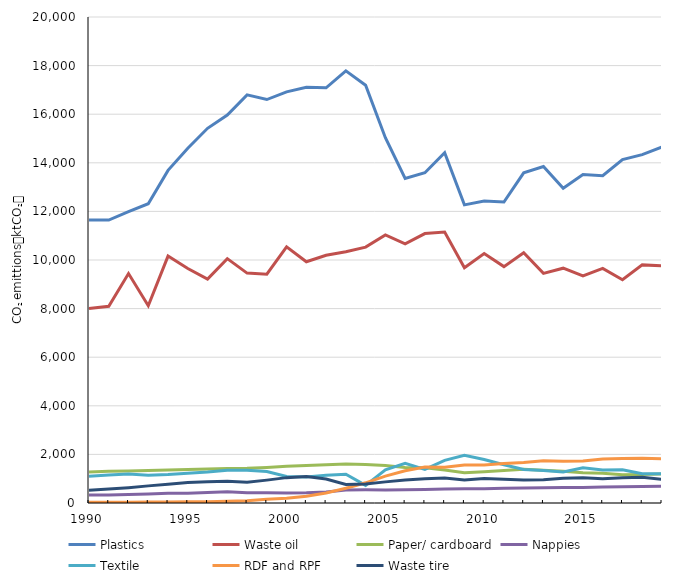
| Category | Plastics | Waste oil | Paper/ cardboard | Nappies | Textile | RDF and RPF | Waste tire |
|---|---|---|---|---|---|---|---|
| 1990.0 | 11648.086 | 7999.541 | 1275.543 | 331.81 | 1098.79 | 34.314 | 526.861 |
| 1991.0 | 11643.228 | 8094.996 | 1311.194 | 329.37 | 1147.652 | 34.314 | 571.418 |
| 1992.0 | 11988.974 | 9442.154 | 1320.871 | 347.668 | 1189.886 | 34.314 | 630.325 |
| 1993.0 | 12314.102 | 8118.312 | 1334.398 | 374.506 | 1142.625 | 41.467 | 704.837 |
| 1994.0 | 13688.559 | 10161.076 | 1357.948 | 400.123 | 1175.451 | 44.124 | 770.96 |
| 1995.0 | 14598.872 | 9652.262 | 1375.867 | 406.223 | 1227.623 | 50.897 | 845.166 |
| 1996.0 | 15419.045 | 9211.965 | 1399.255 | 434.28 | 1278.381 | 53.427 | 872.744 |
| 1997.0 | 15966.662 | 10056.47 | 1420.915 | 458.678 | 1347.411 | 72.73 | 891.336 |
| 1998.0 | 16796.607 | 9460.544 | 1430.889 | 423.301 | 1348.352 | 97.234 | 850.194 |
| 1999.0 | 16602.94 | 9417.258 | 1464.736 | 424.573 | 1295.176 | 155.744 | 941.742 |
| 2000.0 | 16921.165 | 10543.673 | 1510.774 | 414.981 | 1092.153 | 197.435 | 1044.119 |
| 2001.0 | 17112.213 | 9926.192 | 1542.13 | 418.875 | 1074.687 | 280.924 | 1085.438 |
| 2002.0 | 17086.213 | 10193.9 | 1578.091 | 449.029 | 1145.145 | 411.984 | 986.927 |
| 2003.0 | 17784.983 | 10337.862 | 1609.431 | 536.02 | 1184.421 | 605.66 | 762.206 |
| 2004.0 | 17189.808 | 10530.894 | 1582.224 | 542.735 | 723.432 | 830.759 | 783.184 |
| 2005.0 | 15031.247 | 11033.827 | 1543.448 | 539.228 | 1367.161 | 1106.992 | 869.159 |
| 2006.0 | 13352.98 | 10668.671 | 1464.136 | 547.367 | 1628.445 | 1328.266 | 949.372 |
| 2007.0 | 13592.37 | 11087.203 | 1446.594 | 558.502 | 1385.363 | 1482.283 | 997.7 |
| 2008.0 | 14413.987 | 11150.395 | 1354.979 | 572.346 | 1752.201 | 1467.636 | 1027.996 |
| 2009.0 | 12268.857 | 9682.489 | 1244.942 | 583.918 | 1964.079 | 1558.876 | 950.779 |
| 2010.0 | 12431.225 | 10267.57 | 1286.924 | 589.549 | 1792.776 | 1559.279 | 1007.766 |
| 2011.0 | 12384.442 | 9727.398 | 1335.548 | 601.995 | 1571.998 | 1623.839 | 975.869 |
| 2012.0 | 13588.674 | 10296.63 | 1390.044 | 616.169 | 1380.487 | 1667.048 | 950.65 |
| 2013.0 | 13848.116 | 9451.153 | 1344.645 | 628.144 | 1338.34 | 1737.351 | 957.556 |
| 2014.0 | 12955.051 | 9662.743 | 1305.26 | 640.744 | 1275.979 | 1714.326 | 1014.271 |
| 2015.0 | 13520.531 | 9348.528 | 1243.651 | 639.188 | 1449.98 | 1724.084 | 1037.043 |
| 2016.0 | 13467.314 | 9657.121 | 1226.214 | 655.603 | 1358.328 | 1813.443 | 997.068 |
| 2017.0 | 14134.456 | 9184.321 | 1163.727 | 666.389 | 1370.078 | 1826.196 | 1036.02 |
| 2018.0 | 14337.716 | 9798.81 | 1177.772 | 678.799 | 1202.05 | 1846.286 | 1063.735 |
| 2019.0 | 14654.404 | 9761.343 | 1191.513 | 687.938 | 1207.925 | 1819.166 | 973.496 |